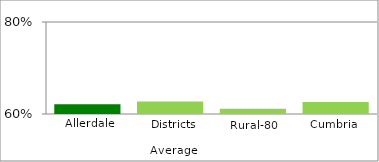
| Category | Series 1 |
|---|---|
| Allerdale | 0.621 |
| Districts Average | 0.627 |
| Rural-80 | 0.612 |
| Cumbria | 0.626 |